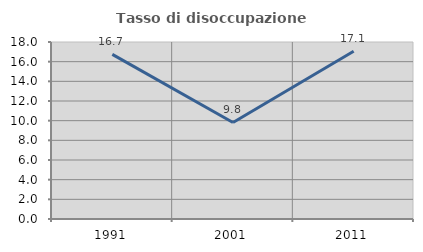
| Category | Tasso di disoccupazione giovanile  |
|---|---|
| 1991.0 | 16.746 |
| 2001.0 | 9.816 |
| 2011.0 | 17.054 |